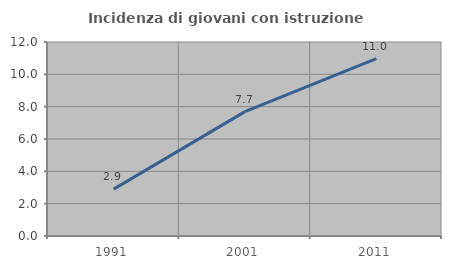
| Category | Incidenza di giovani con istruzione universitaria |
|---|---|
| 1991.0 | 2.899 |
| 2001.0 | 7.692 |
| 2011.0 | 10.976 |